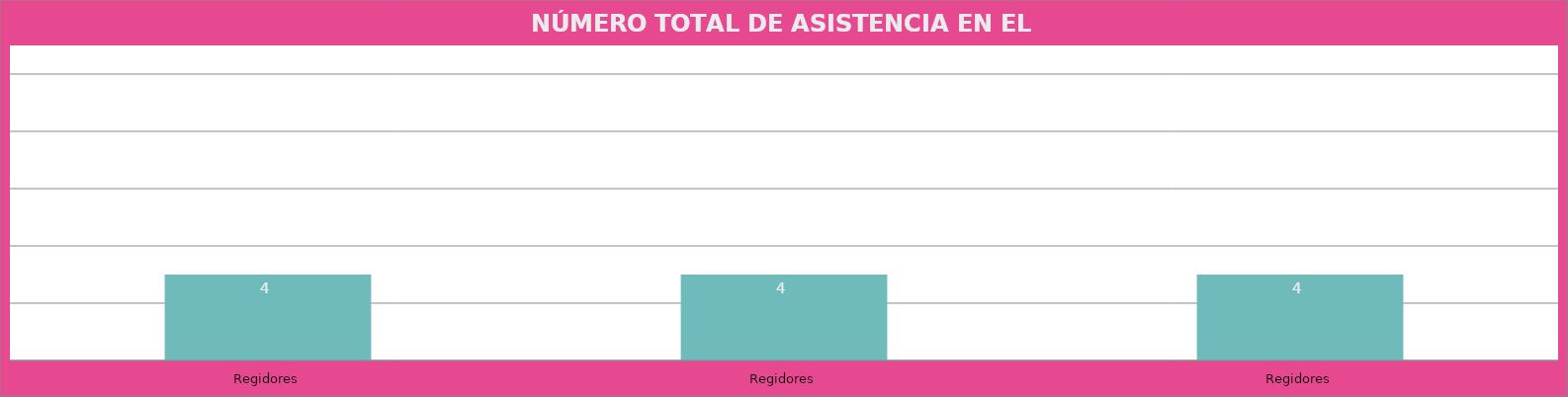
| Category | Regidores |
|---|---|
| Regidores | 4 |
| Regidores | 4 |
| Regidores | 4 |